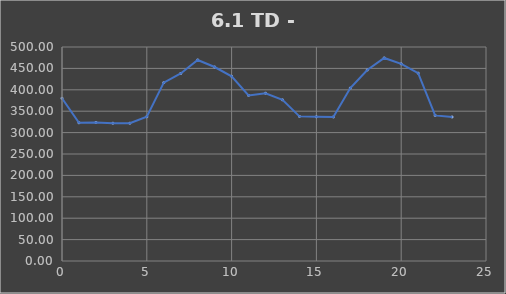
| Category | TOTAL |
|---|---|
| 0.0 | 380.085 |
| 1.0 | 323.015 |
| 2.0 | 323.675 |
| 3.0 | 321.985 |
| 4.0 | 321.985 |
| 5.0 | 337.095 |
| 6.0 | 416.745 |
| 7.0 | 438.145 |
| 8.0 | 469.662 |
| 9.0 | 453.231 |
| 10.0 | 431.581 |
| 11.0 | 386.981 |
| 12.0 | 392.031 |
| 13.0 | 376.551 |
| 14.0 | 337.902 |
| 15.0 | 336.972 |
| 16.0 | 336.572 |
| 17.0 | 403.982 |
| 18.0 | 446.271 |
| 19.0 | 474.381 |
| 20.0 | 460.641 |
| 21.0 | 438.921 |
| 22.0 | 340.222 |
| 23.0 | 336.472 |